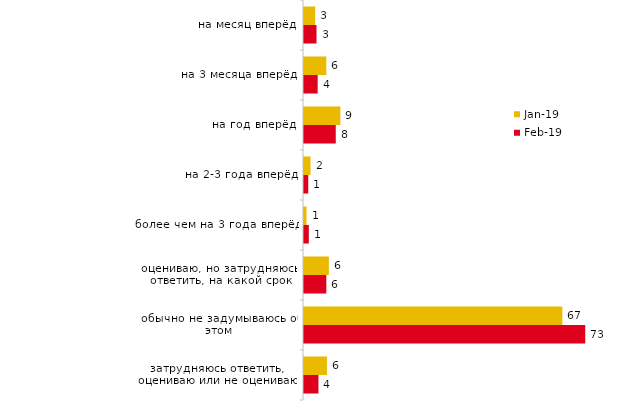
| Category | янв.19 | фев.19 |
|---|---|---|
| на месяц вперёд | 2.9 | 3.25 |
| на 3 месяца вперёд | 5.8 | 3.55 |
| на год вперёд | 9.45 | 8.25 |
| на 2-3 года вперёд | 1.7 | 1.1 |
| более чем на 3 года вперёд | 0.65 | 1.25 |
| оцениваю, но затрудняюсь ответить, на какой срок | 6.45 | 5.8 |
| обычно не задумываюсь об этом | 67.1 | 73.05 |
| затрудняюсь ответить, оцениваю или не оцениваю | 5.95 | 3.75 |